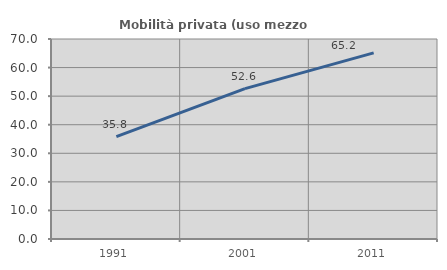
| Category | Mobilità privata (uso mezzo privato) |
|---|---|
| 1991.0 | 35.838 |
| 2001.0 | 52.647 |
| 2011.0 | 65.161 |